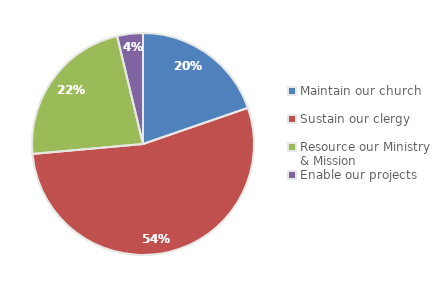
| Category | Series 0 |
|---|---|
| Maintain our church | 15750 |
| Sustain our clergy | 43000 |
| Resource our Ministry & Mission | 18100 |
| Enable our projects | 3000 |